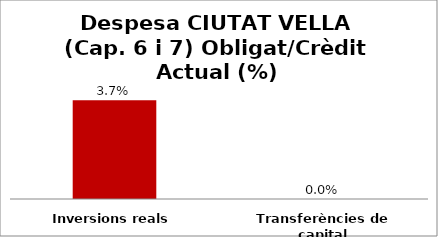
| Category | Series 0 |
|---|---|
| Inversions reals | 0.037 |
| Transferències de capital | 0 |